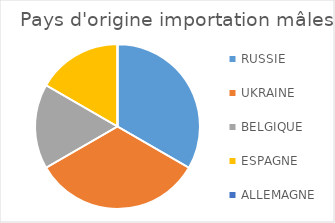
| Category | Series 0 |
|---|---|
| RUSSIE | 2 |
| UKRAINE | 2 |
| BELGIQUE | 1 |
| ESPAGNE | 1 |
| ALLEMAGNE | 0 |